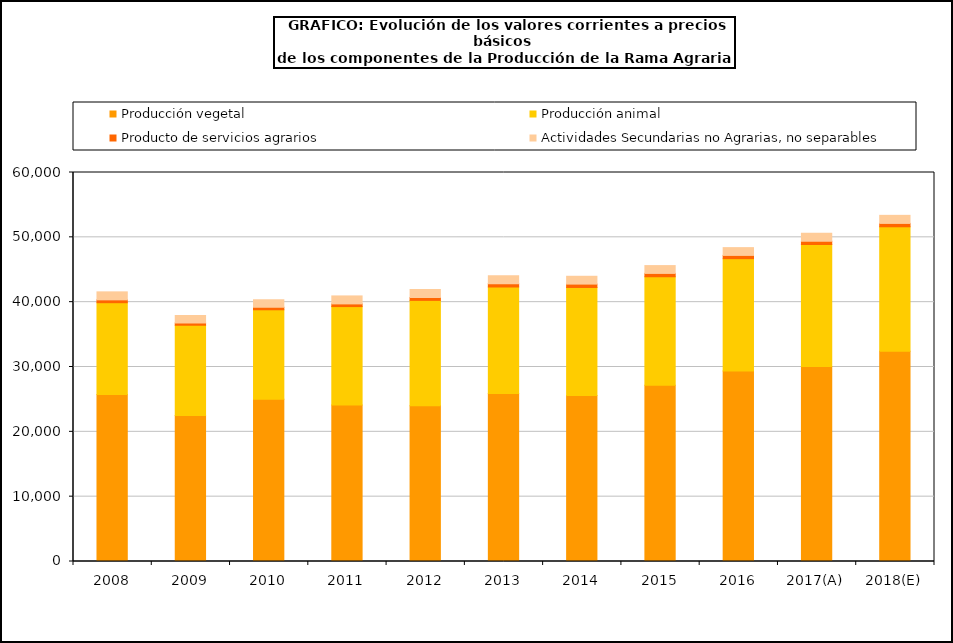
| Category | Producción vegetal | Producción animal | Producto de servicios agrarios | Actividades Secundarias no Agrarias, no separables |
|---|---|---|---|---|
| 2008 | 25756.5 | 14161.6 | 439 | 1232.2 |
| 2009 | 22510 | 13911.4 | 367.9 | 1156.5 |
| 2010 | 25028.1 | 13797.4 | 389.6 | 1156.1 |
| 2011 | 24157.4 | 15160 | 415.1 | 1231.2 |
| 2012 | 24030.3 | 16245.1 | 442.5 | 1236.6 |
| 2013 | 25895.9 | 16457.7 | 468.7 | 1242.3 |
| 2014 | 25585 | 16681.5 | 520.2 | 1207.1 |
| 2015 | 27192.2 | 16727.3 | 514.9 | 1207.6 |
| 2016 | 29398.1 | 17310.6 | 503.7 | 1199.2 |
| 2017(A) | 30081.3 | 18799.8 | 506 | 1226.4 |
| 2018(E) | 32413.1 | 19214.9 | 519.5 | 1244.2 |